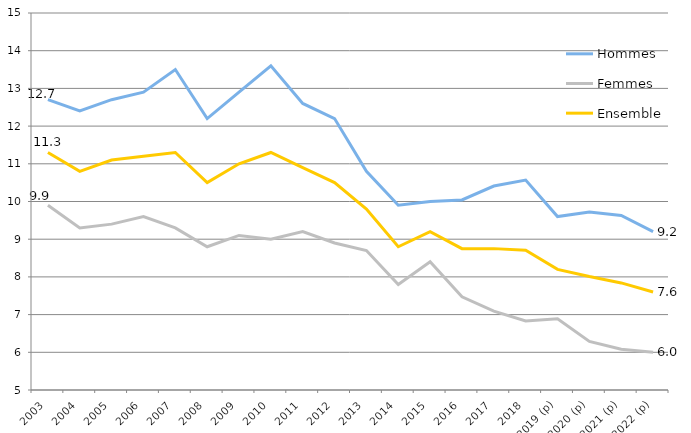
| Category | Hommes | Femmes | Ensemble |
|---|---|---|---|
| 2003 | 12.7 | 9.9 | 11.3 |
| 2004 | 12.4 | 9.3 | 10.8 |
| 2005 | 12.7 | 9.4 | 11.1 |
| 2006 | 12.9 | 9.6 | 11.2 |
| 2007 | 13.5 | 9.3 | 11.3 |
| 2008 | 12.2 | 8.8 | 10.5 |
| 2009 | 12.9 | 9.1 | 11 |
| 2010 | 13.6 | 9 | 11.3 |
| 2011 | 12.6 | 9.2 | 10.9 |
| 2012 | 12.2 | 8.9 | 10.5 |
| 2013 | 10.8 | 8.7 | 9.8 |
| 2014 | 9.9 | 7.8 | 8.8 |
| 2015 | 10 | 8.4 | 9.2 |
| 2016 | 10.04 | 7.47 | 8.75 |
| 2017 | 10.41 | 7.09 | 8.75 |
| 2018 | 10.57 | 6.83 | 8.71 |
| 2019 (p) | 9.6 | 6.89 | 8.2 |
| 2020 (p) | 9.72 | 6.29 | 8.01 |
| 2021 (p) | 9.63 | 6.08 | 7.84 |
| 2022 (p) | 9.2 | 6 | 7.6 |